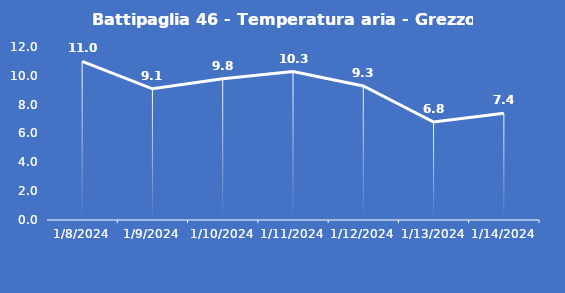
| Category | Battipaglia 46 - Temperatura aria - Grezzo (°C) |
|---|---|
| 1/8/24 | 11 |
| 1/9/24 | 9.1 |
| 1/10/24 | 9.8 |
| 1/11/24 | 10.3 |
| 1/12/24 | 9.3 |
| 1/13/24 | 6.8 |
| 1/14/24 | 7.4 |